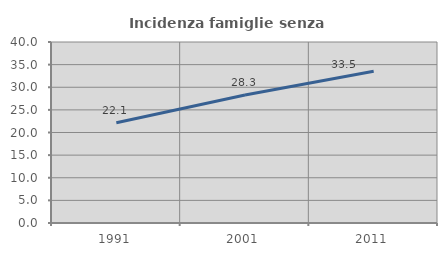
| Category | Incidenza famiglie senza nuclei |
|---|---|
| 1991.0 | 22.146 |
| 2001.0 | 28.275 |
| 2011.0 | 33.529 |